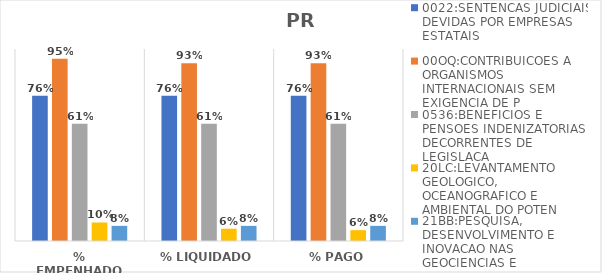
| Category | 0022:SENTENCAS JUDICIAIS DEVIDAS POR EMPRESAS ESTATAIS | 00OQ:CONTRIBUICOES A ORGANISMOS INTERNACIONAIS SEM EXIGENCIA DE P | 0536:BENEFICIOS E PENSOES INDENIZATORIAS DECORRENTES DE LEGISLACA | 20LC:LEVANTAMENTO GEOLOGICO, OCEANOGRAFICO E AMBIENTAL DO POTEN | 21BB:PESQUISA, DESENVOLVIMENTO E INOVACAO NAS GEOCIENCIAS E |
|---|---|---|---|---|---|
| % EMPENHADO | 0.756 | 0.95 | 0.611 | 0.096 | 0.079 |
| % LIQUIDADO | 0.756 | 0.926 | 0.611 | 0.064 | 0.079 |
| % PAGO | 0.756 | 0.926 | 0.611 | 0.056 | 0.079 |